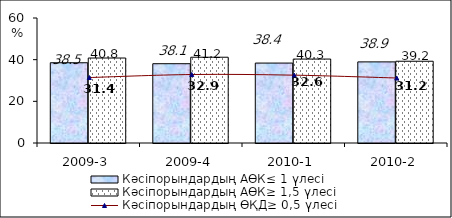
| Category | Кәсіпорындардың АӨК≤ 1 үлесі | Кәсіпорындардың АӨК≥ 1,5 үлесі |
|---|---|---|
| 2009-3 | 38.52 | 40.79 |
| 2009-4 | 38.06 | 41.17 |
| 2010-1 | 38.37 | 40.29 |
| 2010-2 | 38.94 | 39.24 |